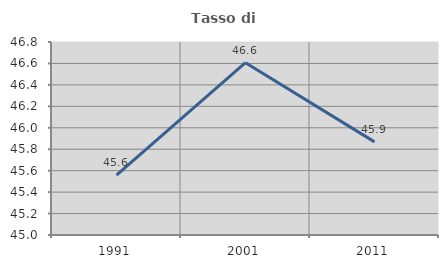
| Category | Tasso di occupazione   |
|---|---|
| 1991.0 | 45.557 |
| 2001.0 | 46.607 |
| 2011.0 | 45.869 |